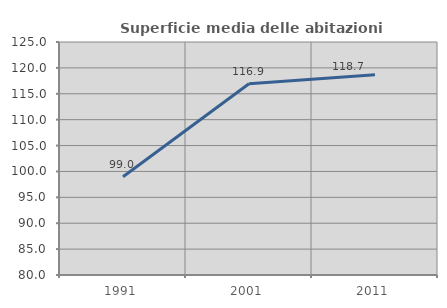
| Category | Superficie media delle abitazioni occupate |
|---|---|
| 1991.0 | 98.987 |
| 2001.0 | 116.936 |
| 2011.0 | 118.681 |